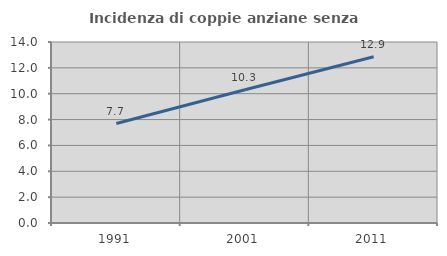
| Category | Incidenza di coppie anziane senza figli  |
|---|---|
| 1991.0 | 7.692 |
| 2001.0 | 10.302 |
| 2011.0 | 12.859 |